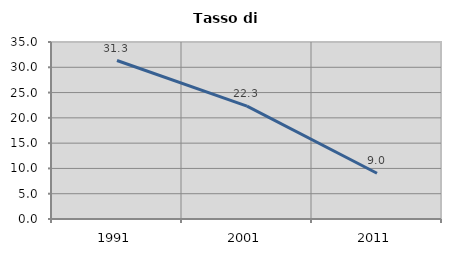
| Category | Tasso di disoccupazione   |
|---|---|
| 1991.0 | 31.34 |
| 2001.0 | 22.308 |
| 2011.0 | 9.04 |